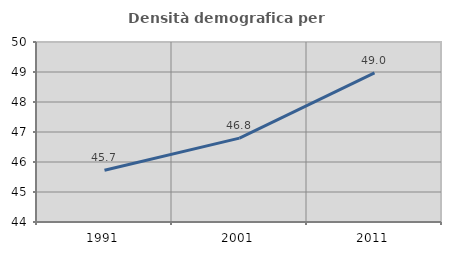
| Category | Densità demografica |
|---|---|
| 1991.0 | 45.724 |
| 2001.0 | 46.795 |
| 2011.0 | 48.968 |